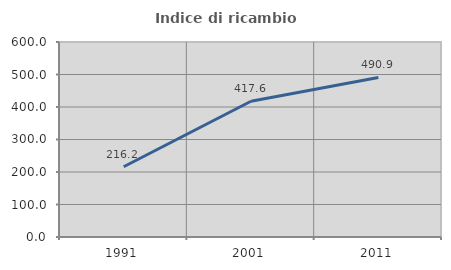
| Category | Indice di ricambio occupazionale  |
|---|---|
| 1991.0 | 216.176 |
| 2001.0 | 417.647 |
| 2011.0 | 490.909 |